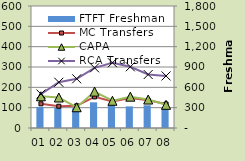
| Category | FTFT Freshman |
|---|---|
| 01 | 311 |
| 02 | 299 |
| 03 | 290 |
| 04 | 379 |
| 05 | 342 |
| 06 | 319 |
| 07 | 335 |
| 08 | 302 |